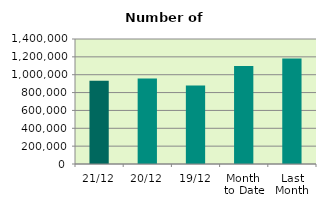
| Category | Series 0 |
|---|---|
| 21/12 | 931990 |
| 20/12 | 958624 |
| 19/12 | 878336 |
| Month 
to Date | 1097478.667 |
| Last
Month | 1182027.273 |